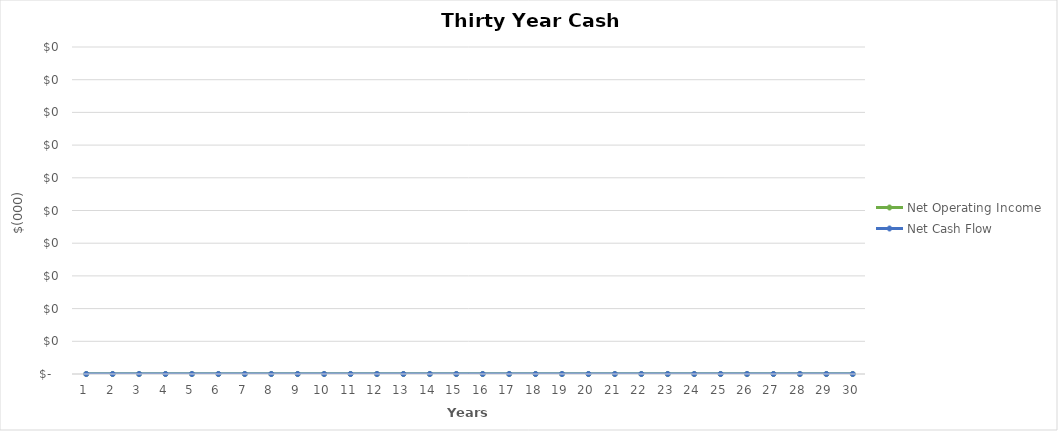
| Category | Net Operating Income | Net Cash Flow |
|---|---|---|
| 0 | 0 | 0 |
| 1 | 0 | 0 |
| 2 | 0 | 0 |
| 3 | 0 | 0 |
| 4 | 0 | 0 |
| 5 | 0 | 0 |
| 6 | 0 | 0 |
| 7 | 0 | 0 |
| 8 | 0 | 0 |
| 9 | 0 | 0 |
| 10 | 0 | 0 |
| 11 | 0 | 0 |
| 12 | 0 | 0 |
| 13 | 0 | 0 |
| 14 | 0 | 0 |
| 15 | 0 | 0 |
| 16 | 0 | 0 |
| 17 | 0 | 0 |
| 18 | 0 | 0 |
| 19 | 0 | 0 |
| 20 | 0 | 0 |
| 21 | 0 | 0 |
| 22 | 0 | 0 |
| 23 | 0 | 0 |
| 24 | 0 | 0 |
| 25 | 0 | 0 |
| 26 | 0 | 0 |
| 27 | 0 | 0 |
| 28 | 0 | 0 |
| 29 | 0 | 0 |